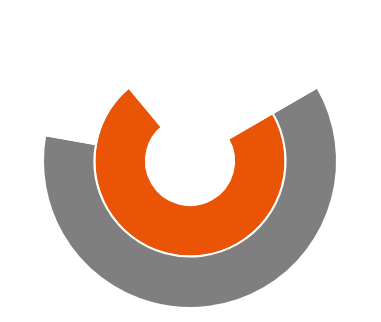
| Category | Сеть | Город |
|---|---|---|
| Данные 1 | 3362288.832 | 14961411.27 |
| Данные 2 | 1288765.868 | 9506379.799 |